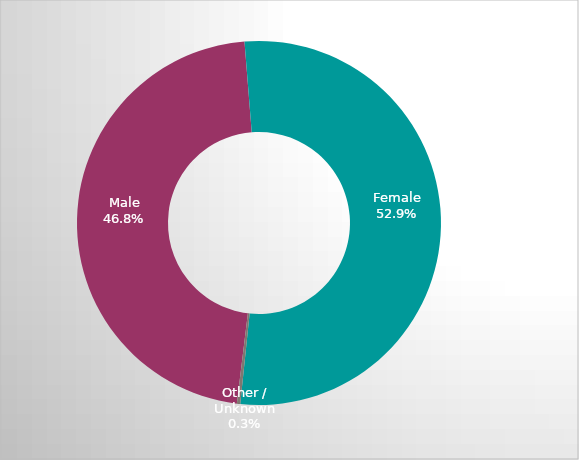
| Category | United States  |
|---|---|
| Male | 0.468 |
| Female | 0.529 |
| Other / Unknown | 0.003 |